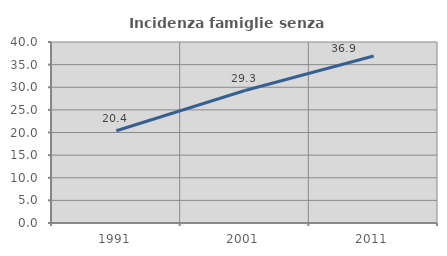
| Category | Incidenza famiglie senza nuclei |
|---|---|
| 1991.0 | 20.395 |
| 2001.0 | 29.272 |
| 2011.0 | 36.913 |